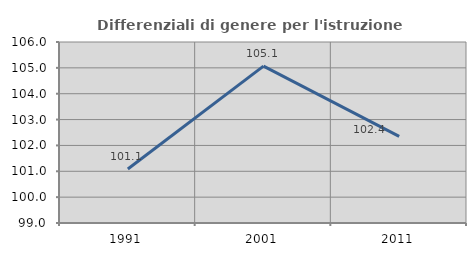
| Category | Differenziali di genere per l'istruzione superiore |
|---|---|
| 1991.0 | 101.086 |
| 2001.0 | 105.066 |
| 2011.0 | 102.353 |